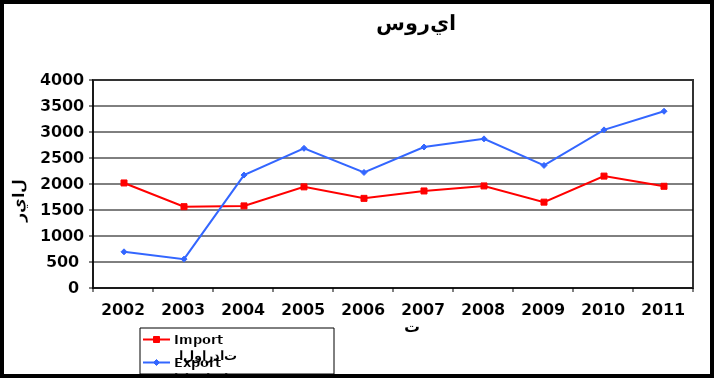
| Category |  الواردات           Import | الصادرات          Export |
|---|---|---|
| 2002.0 | 2020 | 696 |
| 2003.0 | 1564 | 555 |
| 2004.0 | 1579 | 2172 |
| 2005.0 | 1945 | 2686 |
| 2006.0 | 1724 | 2222 |
| 2007.0 | 1866 | 2711 |
| 2008.0 | 1963 | 2868 |
| 2009.0 | 1651 | 2357 |
| 2010.0 | 2152 | 3041 |
| 2011.0 | 1956 | 3399 |